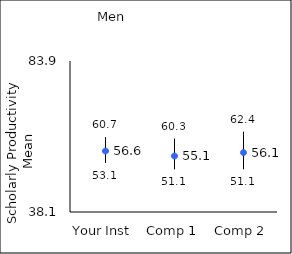
| Category | 25th percentile | 75th percentile | Mean |
|---|---|---|---|
| Your Inst | 53.1 | 60.7 | 56.6 |
| Comp 1 | 51.1 | 60.3 | 55.07 |
| Comp 2 | 51.1 | 62.4 | 56.13 |